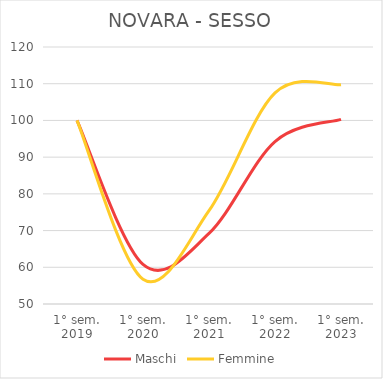
| Category | Maschi | Femmine |
|---|---|---|
| 1° sem.
2019 | 100 | 100 |
| 1° sem.
2020 | 60.794 | 56.747 |
| 1° sem.
2021 | 69.214 | 75.41 |
| 1° sem.
2022 | 94.257 | 107.482 |
| 1° sem.
2023 | 100.302 | 109.71 |